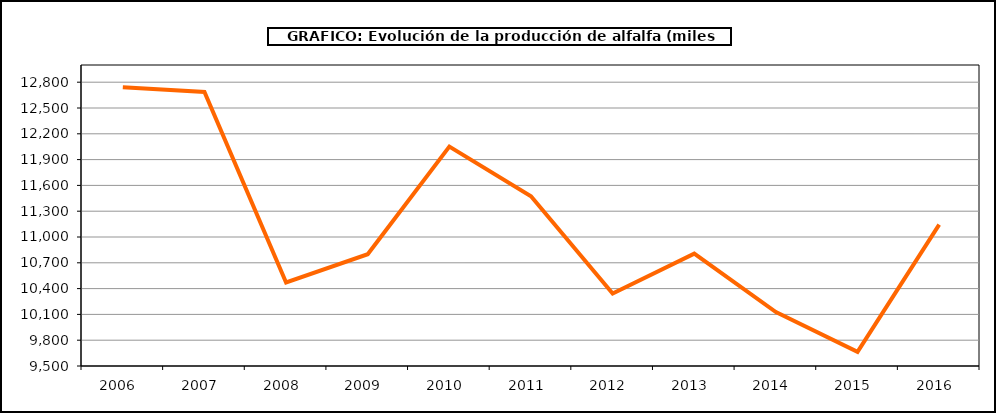
| Category | Producción |
|---|---|
| 2006.0 | 12740.175 |
| 2007.0 | 12685.642 |
| 2008.0 | 10471.156 |
| 2009.0 | 10799.35 |
| 2010.0 | 12051.422 |
| 2011.0 | 11474.193 |
| 2012.0 | 10342.799 |
| 2013.0 | 10806.54 |
| 2014.0 | 10126.971 |
| 2015.0 | 9664.728 |
| 2016.0 | 11143.962 |